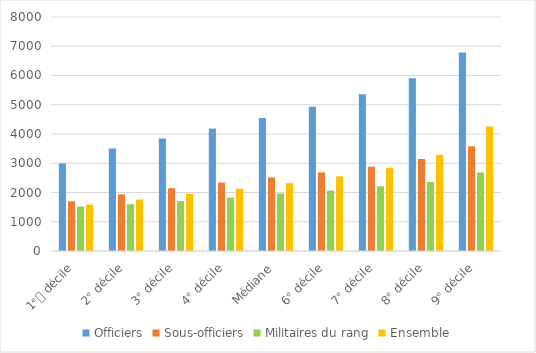
| Category | Officiers | Sous-officiers | Militaires du rang | Ensemble |
|---|---|---|---|---|
| 1ᵉᵜ décile | 2993.53 | 1698.75 | 1521.06 | 1587.16 |
| 2ᵉ décile | 3502.46 | 1935.02 | 1602.31 | 1759.69 |
| 3ᵉ décile | 3847.61 | 2144.73 | 1705.93 | 1956.42 |
| 4ᵉ décile | 4186.21 | 2341.87 | 1826.66 | 2130.01 |
| Médiane | 4543.99 | 2514.04 | 1965.48 | 2321.77 |
| 6ᵉ décile | 4932.97 | 2689.11 | 2066.24 | 2552.53 |
| 7ᵉ décile | 5358.97 | 2882.64 | 2214.15 | 2849.66 |
| 8ᵉ décile | 5902.85 | 3145.79 | 2361.85 | 3287.13 |
| 9ᵉ décile | 6785.18 | 3577.97 | 2684.44 | 4259.04 |